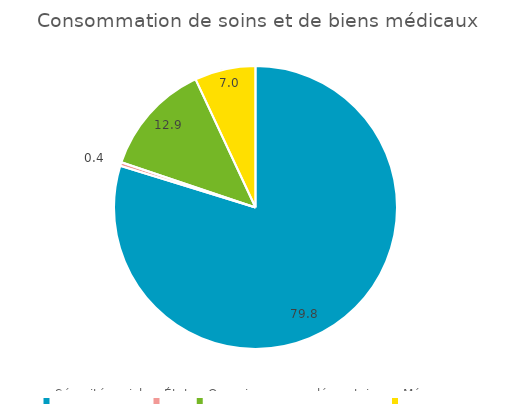
| Category | Consommation de soins
et de biens médicaux |
|---|---|
| Sécurité sociale | 79.756 |
| État  | 0.425 |
| Organismes complémentaires | 12.859 |
| Ménages | 6.96 |